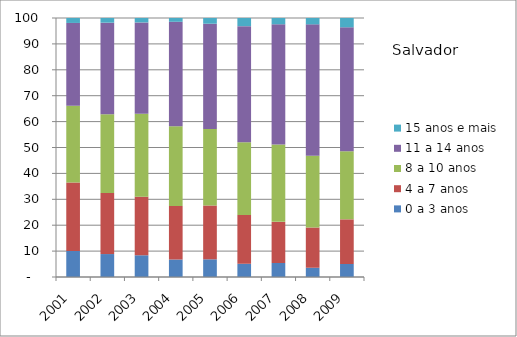
| Category | 0 a 3 anos | 4 a 7 anos | 8 a 10 anos | 11 a 14 anos | 15 anos e mais |
|---|---|---|---|---|---|
| 2001.0 | 10.08 | 26.41 | 29.66 | 31.94 | 1.9 |
| 2002.0 | 8.86 | 23.57 | 30.45 | 35.31 | 1.81 |
| 2003.0 | 8.39 | 22.61 | 32.05 | 35.24 | 1.72 |
| 2004.0 | 6.75 | 20.68 | 30.74 | 40.37 | 1.46 |
| 2005.0 | 6.83 | 20.78 | 29.49 | 40.69 | 2.21 |
| 2006.0 | 5.11 | 18.86 | 28.03 | 44.85 | 3.15 |
| 2007.0 | 5.4 | 15.89 | 29.87 | 46.42 | 2.43 |
| 2008.0 | 3.57 | 15.54 | 27.75 | 50.68 | 2.46 |
| 2009.0 | 5.02 | 17.24 | 26.29 | 47.86 | 3.58 |